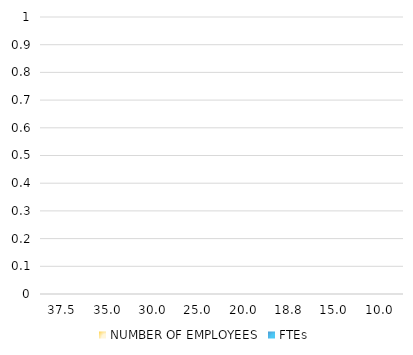
| Category | NUMBER OF EMPLOYEES | FTEs |
|---|---|---|
| 37.5 |  | 0 |
| 35.0 |  | 0 |
| 30.0 |  | 0 |
| 25.0 |  | 0 |
| 20.0 |  | 0 |
| 18.75 |  | 0 |
| 15.0 |  | 0 |
| 10.0 |  | 0 |